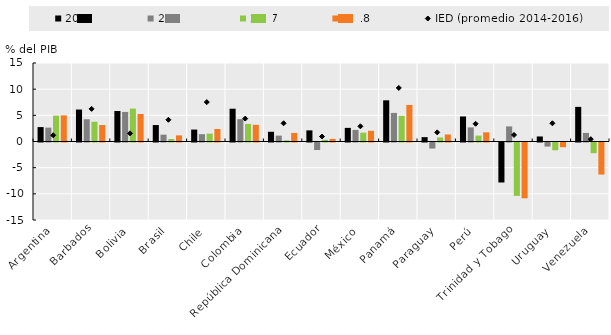
| Category | 2015 | 2016 | 2017 | 2018 |
|---|---|---|---|---|
| Argentina | 2.754 | 2.651 | 4.946 | 4.991 |
| Barbados | 6.106 | 4.251 | 3.78 | 3.147 |
| Bolivia | 5.825 | 5.65 | 6.285 | 5.25 |
| Brasil | 3.144 | 1.308 | 0.474 | 1.169 |
| Chile | 2.281 | 1.404 | 1.506 | 2.397 |
| Colombia | 6.267 | 4.262 | 3.363 | 3.191 |
| República Dominicana | 1.858 | 1.125 | 0.217 | 1.638 |
| Ecuador | 2.126 | -1.443 | 0.334 | 0.5 |
| México | 2.603 | 2.216 | 1.69 | 2.043 |
| Panamá | 7.869 | 5.465 | 4.91 | 6.995 |
| Paraguay | 0.833 | -1.153 | 0.766 | 1.343 |
| Perú | 4.785 | 2.693 | 1.127 | 1.755 |
| Trinidad y Tobago | -7.64 | 2.883 | -10.207 | -10.657 |
| Uruguay | 0.96 | -0.779 | -1.485 | -0.901 |
| Venezuela | 6.616 | 1.639 | -2.036 | -6.128 |